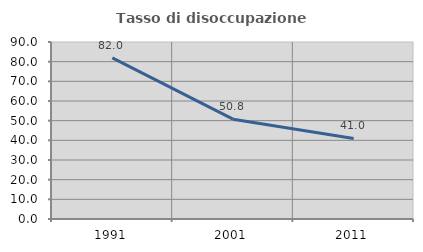
| Category | Tasso di disoccupazione giovanile  |
|---|---|
| 1991.0 | 81.955 |
| 2001.0 | 50.769 |
| 2011.0 | 40.984 |